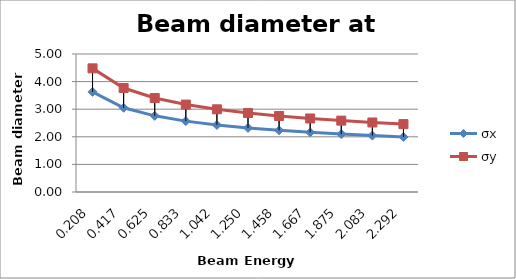
| Category | σx | σy |
|---|---|---|
| 0.20833333333333334 | 3.629 | 4.48 |
| 0.4166666666666667 | 3.052 | 3.767 |
| 0.625 | 2.759 | 3.404 |
| 0.8333333333333334 | 2.568 | 3.168 |
| 1.0416666666666667 | 2.429 | 2.996 |
| 1.25 | 2.321 | 2.862 |
| 1.4583333333333333 | 2.234 | 2.754 |
| 1.6666666666666667 | 2.161 | 2.664 |
| 1.875 | 2.099 | 2.586 |
| 2.0833333333333335 | 2.044 | 2.519 |
| 2.2916666666666665 | 1.996 | 2.46 |